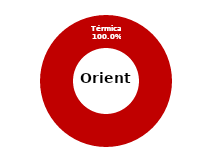
| Category | Oriente |
|---|---|
| Eólica | 0 |
| Hidráulica | 0 |
| Solar | 0 |
| Térmica | 34.898 |